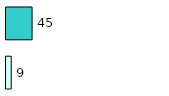
| Category | Series 0 | Series 1 |
|---|---|---|
| 0 | 9 | 45 |